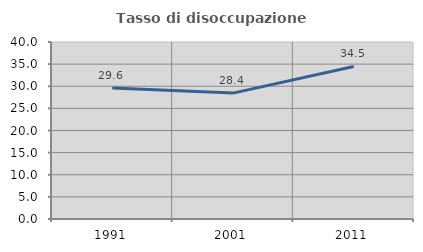
| Category | Tasso di disoccupazione giovanile  |
|---|---|
| 1991.0 | 29.586 |
| 2001.0 | 28.448 |
| 2011.0 | 34.483 |